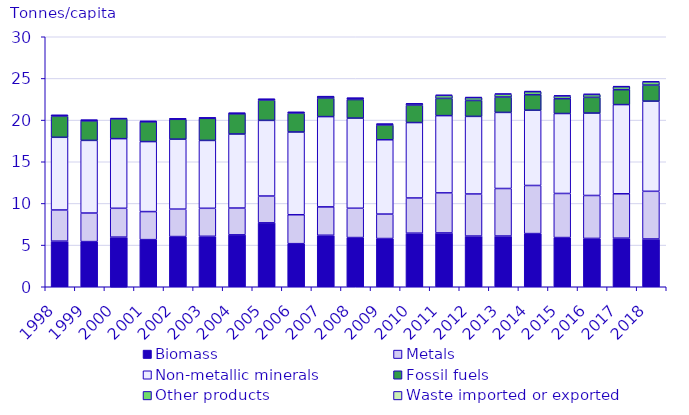
| Category | Biomass | Metals | Non-metallic minerals | Fossil fuels | Other products | Waste imported or exported |
|---|---|---|---|---|---|---|
| 1998.0 | 5.472 | 3.741 | 8.723 | 2.519 | 0.122 | 0 |
| 1999.0 | 5.418 | 3.428 | 8.719 | 2.34 | 0.088 | 0 |
| 2000.0 | 5.954 | 3.462 | 8.355 | 2.372 | 0.099 | 0 |
| 2001.0 | 5.654 | 3.365 | 8.401 | 2.374 | 0.062 | 0 |
| 2002.0 | 6.023 | 3.291 | 8.398 | 2.382 | 0.059 | 0 |
| 2003.0 | 6.054 | 3.362 | 8.144 | 2.651 | 0.053 | 0 |
| 2004.0 | 6.228 | 3.218 | 8.883 | 2.423 | 0.078 | 0 |
| 2005.0 | 7.669 | 3.218 | 9.077 | 2.418 | 0.122 | 0.002 |
| 2006.0 | 5.171 | 3.471 | 9.93 | 2.256 | 0.11 | 0.001 |
| 2007.0 | 6.18 | 3.406 | 10.832 | 2.219 | 0.177 | 0.001 |
| 2008.0 | 5.903 | 3.517 | 10.817 | 2.227 | 0.166 | 0.003 |
| 2009.0 | 5.787 | 2.934 | 8.921 | 1.764 | 0.11 | 0.017 |
| 2010.0 | 6.431 | 4.221 | 9.051 | 2.085 | 0.167 | 0.031 |
| 2011.0 | 6.458 | 4.806 | 9.27 | 2.071 | 0.357 | 0.049 |
| 2012.0 | 6.083 | 5.049 | 9.31 | 1.912 | 0.341 | 0.056 |
| 2013.0 | 6.087 | 5.704 | 9.13 | 1.845 | 0.346 | 0.058 |
| 2014.0 | 6.379 | 5.773 | 9.03 | 1.866 | 0.36 | 0.068 |
| 2015.0 | 5.904 | 5.292 | 9.593 | 1.781 | 0.324 | 0.068 |
| 2016.0 | 5.8 | 5.153 | 9.889 | 1.887 | 0.338 | 0.071 |
| 2017.0 | 5.829 | 5.328 | 10.703 | 1.793 | 0.347 | 0.075 |
| 2018.0 | 5.731 | 5.723 | 10.819 | 1.926 | 0.385 | 0.072 |